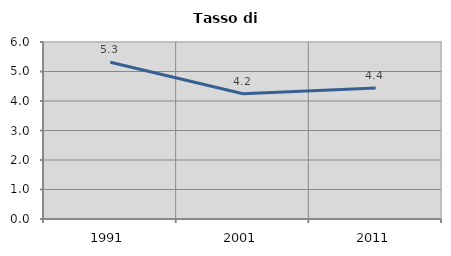
| Category | Tasso di disoccupazione   |
|---|---|
| 1991.0 | 5.312 |
| 2001.0 | 4.247 |
| 2011.0 | 4.44 |